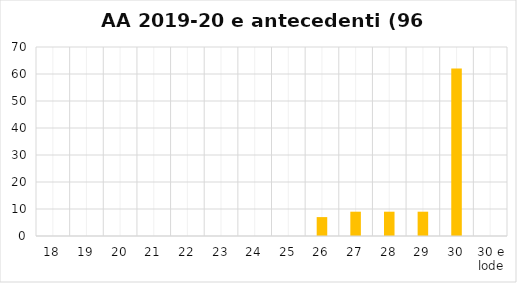
| Category | Series 0 |
|---|---|
| 18 | 0 |
| 19 | 0 |
| 20 | 0 |
| 21 | 0 |
| 22 | 0 |
| 23 | 0 |
| 24 | 0 |
| 25 | 0 |
| 26 | 7 |
| 27 | 9 |
| 28 | 9 |
| 29 | 9 |
| 30 | 62 |
| 30 e lode | 0 |